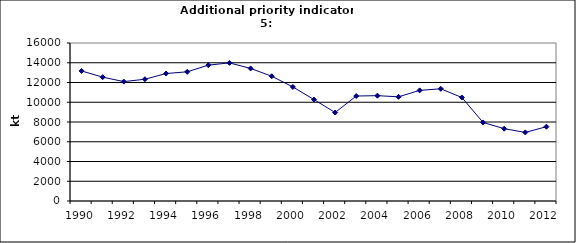
| Category | Production of oxygen steel, kt |
|---|---|
| 1990 | 13169 |
| 1991 | 12540 |
| 1992 | 12091 |
| 1993 | 12330 |
| 1994 | 12909 |
| 1995 | 13083 |
| 1996 | 13759 |
| 1997 | 13987 |
| 1998 | 13426 |
| 1999 | 12633 |
| 2000 | 11551 |
| 2001 | 10271 |
| 2002 | 8956 |
| 2003 | 10630 |
| 2004 | 10667 |
| 2005 | 10549.7 |
| 2006 | 11202.6 |
| 2007 | 11361.9 |
| 2008 | 10478 |
| 2009 | 7955 |
| 2010 | 7322.9 |
| 2011 | 6946.2 |
| 2012 | 7525.1 |